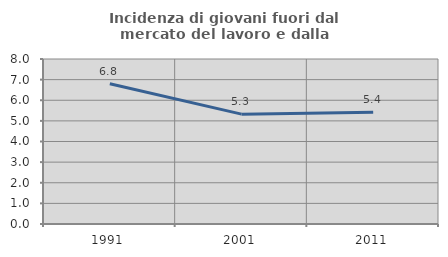
| Category | Incidenza di giovani fuori dal mercato del lavoro e dalla formazione  |
|---|---|
| 1991.0 | 6.804 |
| 2001.0 | 5.325 |
| 2011.0 | 5.418 |